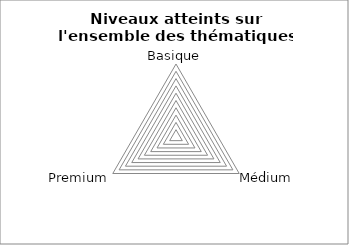
| Category | Series 1 |
|---|---|
| Basique | 0 |
| Médium | 0 |
| Premium | 0 |